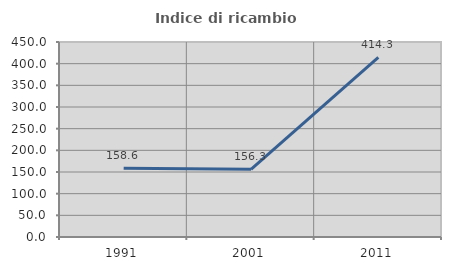
| Category | Indice di ricambio occupazionale  |
|---|---|
| 1991.0 | 158.621 |
| 2001.0 | 156.25 |
| 2011.0 | 414.286 |